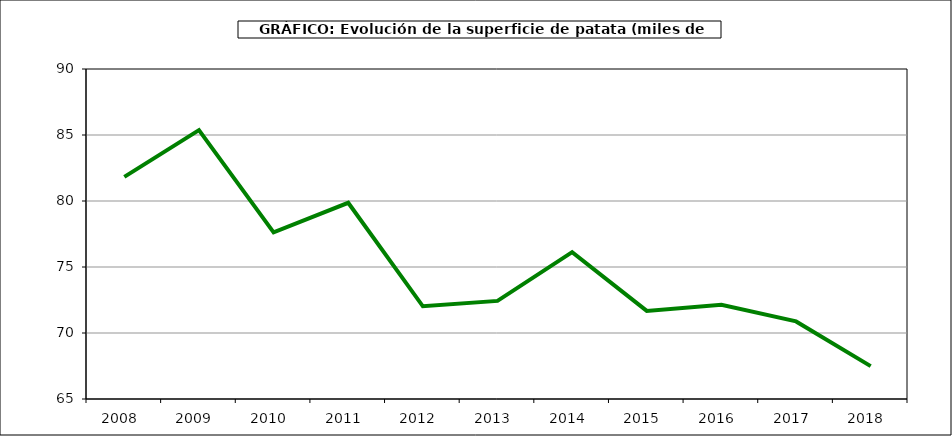
| Category | Superficie |
|---|---|
| 2008.0 | 81.825 |
| 2009.0 | 85.366 |
| 2010.0 | 77.622 |
| 2011.0 | 79.865 |
| 2012.0 | 72.023 |
| 2013.0 | 72.431 |
| 2014.0 | 76.129 |
| 2015.0 | 71.676 |
| 2016.0 | 72.136 |
| 2017.0 | 70.878 |
| 2018.0 | 67.488 |